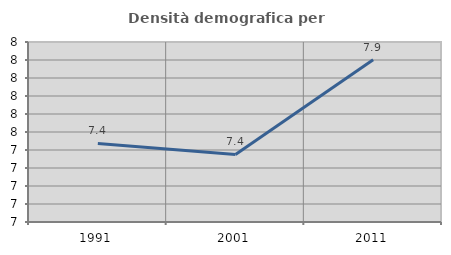
| Category | Densità demografica |
|---|---|
| 1991.0 | 7.436 |
| 2001.0 | 7.376 |
| 2011.0 | 7.902 |